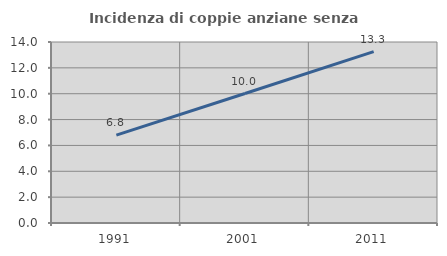
| Category | Incidenza di coppie anziane senza figli  |
|---|---|
| 1991.0 | 6.795 |
| 2001.0 | 10.016 |
| 2011.0 | 13.259 |